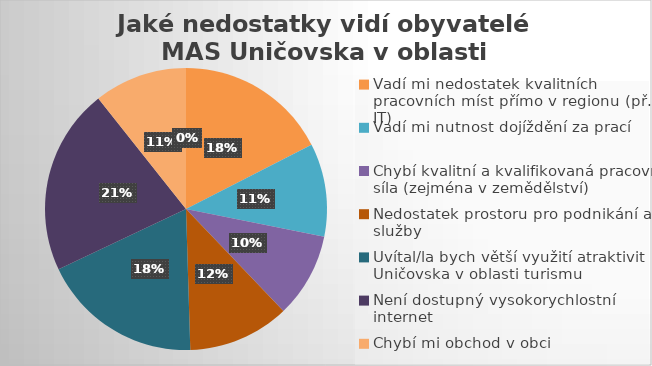
| Category | Series 0 |
|---|---|
| Vadí mi nedostatek kvalitních pracovních míst přímo v regionu (př. IT) | 9 |
| Vadí mi nutnost dojíždění za prací | 5.5 |
| Chybí kvalitní a kvalifikovaná pracovní síla (zejména v zemědělství) | 5 |
| Nedostatek prostoru pro podnikání a služby | 6 |
| Uvítal/la bych větší využití atraktivit Uničovska v oblasti turismu | 9.5 |
| Není dostupný vysokorychlostní internet | 11 |
| Chybí mi obchod v obci | 5.5 |